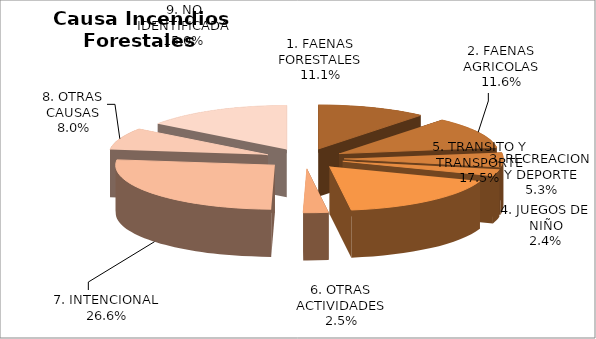
| Category | Series 0 |
|---|---|
| 1. FAENAS FORESTALES | 11.121 |
| 2. FAENAS AGRICOLAS | 11.587 |
| 3. RECREACION Y DEPORTE | 5.256 |
| 4. JUEGOS DE NIÑO | 2.404 |
| 5. TRANSITO Y TRANSPORTE | 17.455 |
| 6. OTRAS ACTIVIDADES | 2.547 |
| 7. INTENCIONAL | 26.56 |
| 8. OTRAS CAUSAS | 8.037 |
| 9. NO IDENTIFICADA | 15.032 |